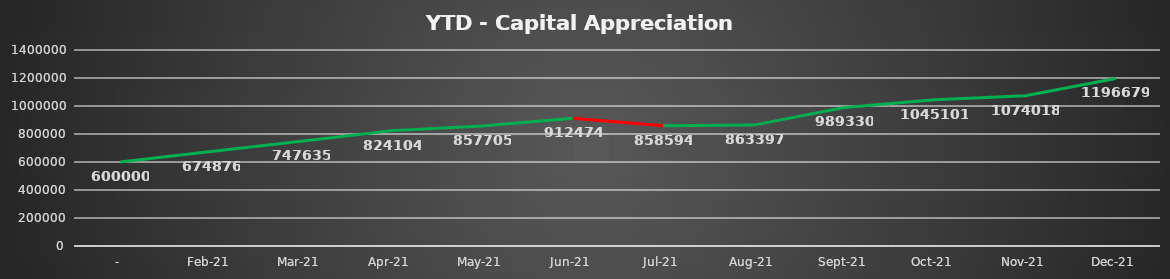
| Category | Capital Appreciation |
|---|---|
| - | 600000 |
| Feb-21 | 674876.08 |
| Mar-21 | 747635.349 |
| Apr-21 | 824103.749 |
| May-21 | 857705.426 |
| Jun-21 | 912474.263 |
| Jul-21 | 858593.914 |
| Aug-21 | 863396.612 |
| Sep-21 | 989329.793 |
| Oct-21 | 1045100.52 |
| Nov-21 | 1074018.02 |
| Dec-21 | 1196678.992 |